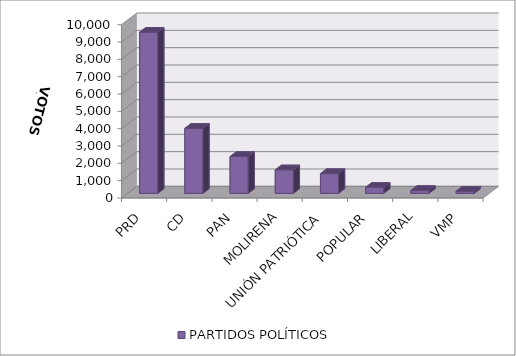
| Category | PARTIDOS POLÍTICOS |
|---|---|
| PRD | 9297 |
| CD | 3749 |
| PAN | 2123 |
| MOLIRENA | 1355 |
| UNIÓN PATRIÓTICA | 1140 |
| POPULAR | 348 |
| LIBERAL | 161 |
| VMP | 123 |